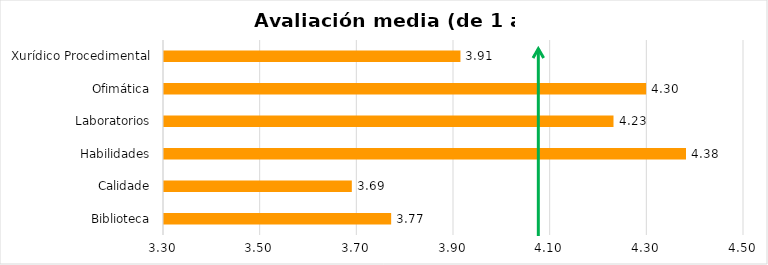
| Category | Series 0 |
|---|---|
| Biblioteca | 3.77 |
| Calidade | 3.689 |
| Habilidades | 4.38 |
| Laboratorios | 4.23 |
| Ofimática | 4.297 |
| Xurídico Procedimental | 3.913 |